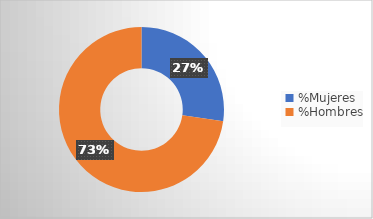
| Category | Integrantes MAC |
|---|---|
| %Mujeres | 0.273 |
| %Hombres | 0.727 |